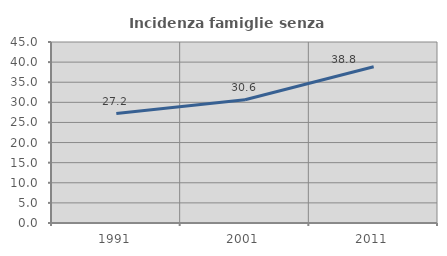
| Category | Incidenza famiglie senza nuclei |
|---|---|
| 1991.0 | 27.213 |
| 2001.0 | 30.646 |
| 2011.0 | 38.828 |